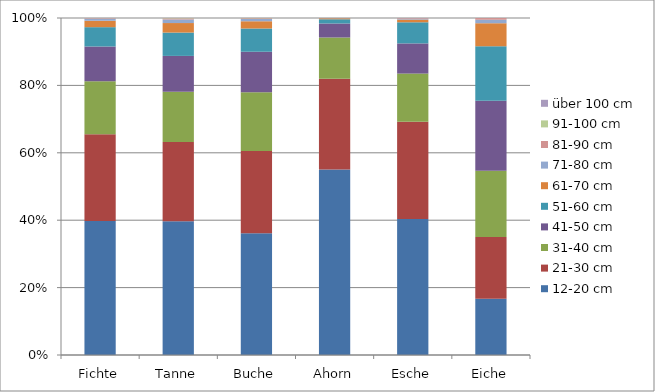
| Category | 12-20 cm | 21-30 cm | 31-40 cm | 41-50 cm | 51-60 cm | 61-70 cm | 71-80 cm | 81-90 cm | 91-100 cm | über 100 cm |
|---|---|---|---|---|---|---|---|---|---|---|
| Fichte | 2735 | 1766.3 | 1082.9 | 709.9 | 394.1 | 130.6 | 41.9 | 11.3 | 2.3 | 1 |
| Tanne | 1859.7 | 1100.7 | 700.6 | 496.6 | 324.6 | 132.4 | 49.4 | 15.2 | 5 | 0.5 |
| Buche | 923.9 | 623.4 | 445.2 | 308.6 | 176.4 | 55.4 | 17 | 4.9 | 1.9 | 0 |
| Ahorn | 530.4 | 259.2 | 118 | 40 | 11.7 | 2.9 | 0.8 | 0 | 0 | 0 |
| Esche | 228.4 | 163.6 | 81 | 50.7 | 35.5 | 4.6 | 1.6 | 1 | 0 | 0 |
| Eiche | 16.1 | 17.7 | 19 | 20.1 | 15.6 | 6.6 | 1 | 0.5 | 0 | 0 |